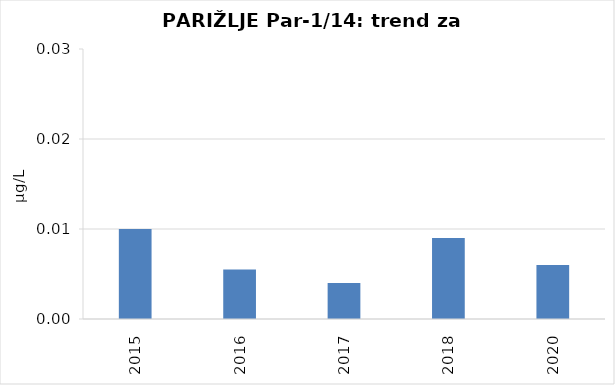
| Category | Vsota |
|---|---|
| 2015 | 0.01 |
| 2016 | 0.006 |
| 2017 | 0.004 |
| 2018 | 0.009 |
| 2020 | 0.006 |